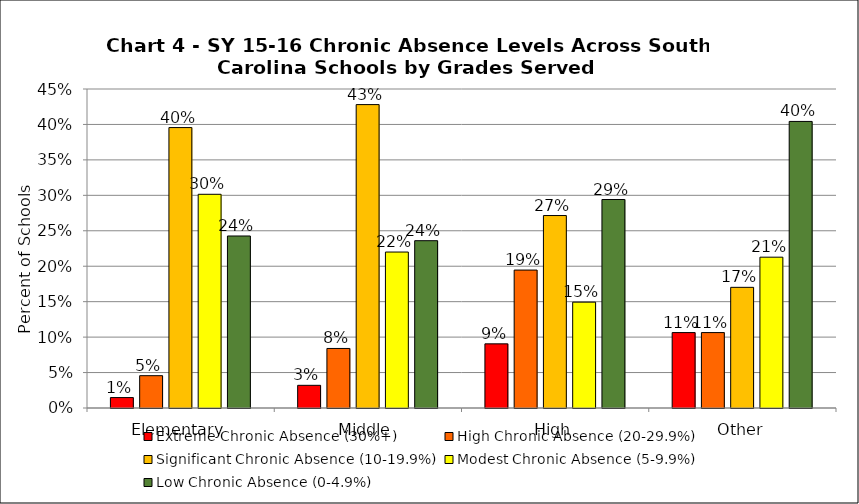
| Category | Extreme Chronic Absence (30%+) | High Chronic Absence (20-29.9%) | Significant Chronic Absence (10-19.9%) | Modest Chronic Absence (5-9.9%) | Low Chronic Absence (0-4.9%) |
|---|---|---|---|---|---|
| 0 | 0.015 | 0.046 | 0.396 | 0.301 | 0.243 |
| 1 | 0.032 | 0.084 | 0.428 | 0.22 | 0.236 |
| 2 | 0.09 | 0.195 | 0.271 | 0.149 | 0.294 |
| 3 | 0.106 | 0.106 | 0.17 | 0.213 | 0.404 |